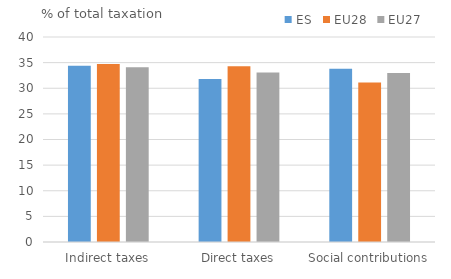
| Category | ES | EU28 | EU27 |
|---|---|---|---|
| Indirect taxes | 34.378 | 34.748 | 34.122 |
| Direct taxes | 31.806 | 34.27 | 33.09 |
| Social contributions | 33.816 | 31.135 | 32.964 |